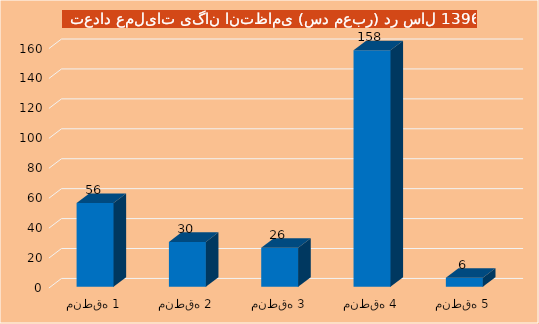
| Category | Series 0 |
|---|---|
| منطقه 1 | 56 |
| منطقه 2 | 30 |
| منطقه 3 | 26 |
| منطقه 4 | 158 |
| منطقه 5 | 6 |